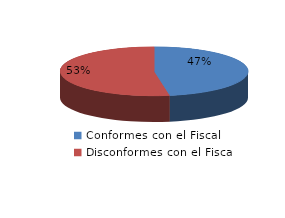
| Category | Series 0 |
|---|---|
| 0 | 27 |
| 1 | 30 |